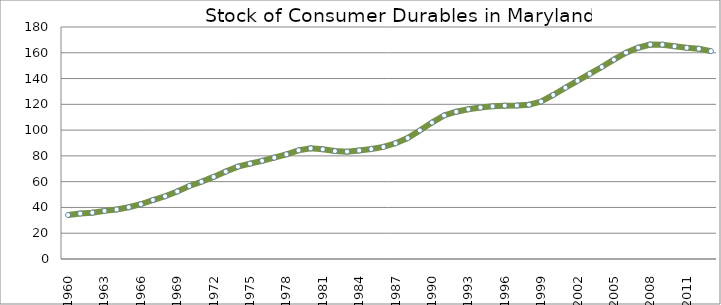
| Category | Series 0 |
|---|---|
| 1960.0 | 34.138 |
| 1961.0 | 35.283 |
| 1962.0 | 35.941 |
| 1963.0 | 37.332 |
| 1964.0 | 38.419 |
| 1965.0 | 40.147 |
| 1966.0 | 42.489 |
| 1967.0 | 45.764 |
| 1968.0 | 48.656 |
| 1969.0 | 52.373 |
| 1970.0 | 56.615 |
| 1971.0 | 59.968 |
| 1972.0 | 63.714 |
| 1973.0 | 67.805 |
| 1974.0 | 71.67 |
| 1975.0 | 73.99 |
| 1976.0 | 76.16 |
| 1977.0 | 78.605 |
| 1978.0 | 81.215 |
| 1979.0 | 84.329 |
| 1980.0 | 85.842 |
| 1981.0 | 85.151 |
| 1982.0 | 83.723 |
| 1983.0 | 83.284 |
| 1984.0 | 84.198 |
| 1985.0 | 85.287 |
| 1986.0 | 86.936 |
| 1987.0 | 89.795 |
| 1988.0 | 93.785 |
| 1989.0 | 99.731 |
| 1990.0 | 105.878 |
| 1991.0 | 111.345 |
| 1992.0 | 114.264 |
| 1993.0 | 116.156 |
| 1994.0 | 117.548 |
| 1995.0 | 118.461 |
| 1996.0 | 118.989 |
| 1997.0 | 119.089 |
| 1998.0 | 119.707 |
| 1999.0 | 122.163 |
| 2000.0 | 127.277 |
| 2001.0 | 132.885 |
| 2002.0 | 138.23 |
| 2003.0 | 143.634 |
| 2004.0 | 148.969 |
| 2005.0 | 154.637 |
| 2006.0 | 160.08 |
| 2007.0 | 163.921 |
| 2008.0 | 166.367 |
| 2009.0 | 166.289 |
| 2010.0 | 165.057 |
| 2011.0 | 163.824 |
| 2012.0 | 163.119 |
| 2013.0 | 161.258 |